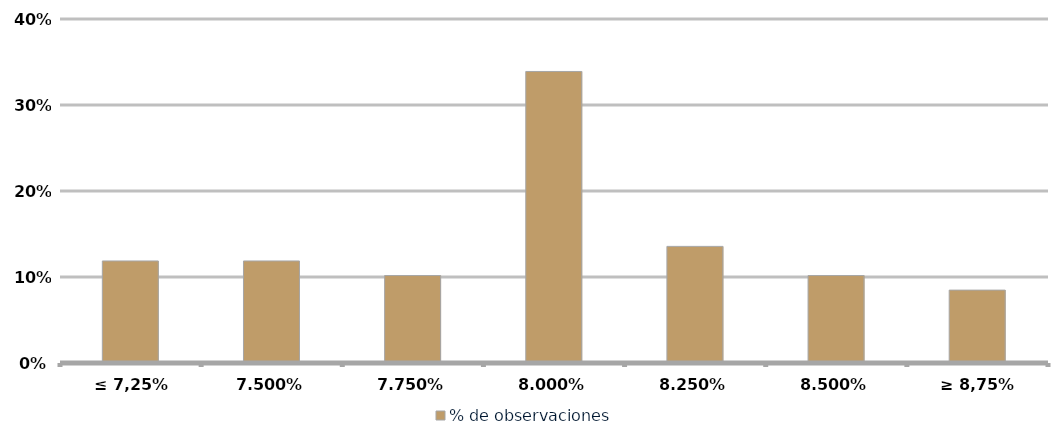
| Category | % de observaciones  |
|---|---|
| ≤ 7,25% | 0.119 |
| 7,50% | 0.119 |
| 7,75% | 0.102 |
| 8,00% | 0.339 |
| 8,25% | 0.136 |
| 8,50% | 0.102 |
| ≥ 8,75% | 0.085 |